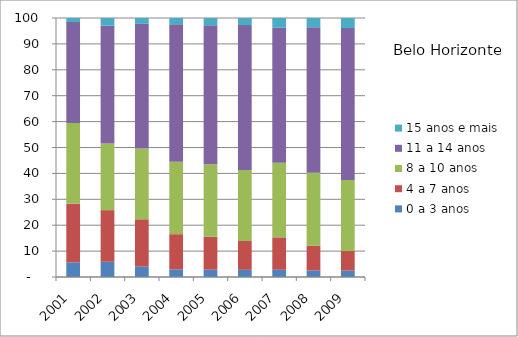
| Category | 0 a 3 anos | 4 a 7 anos | 8 a 10 anos | 11 a 14 anos | 15 anos e mais |
|---|---|---|---|---|---|
| 2001.0 | 5.66 | 22.68 | 31.08 | 38.99 | 2 |
| 2002.0 | 5.88 | 19.94 | 25.72 | 45.49 | 2.97 |
| 2003.0 | 4 | 18.27 | 27.34 | 48.12 | 2.27 |
| 2004.0 | 2.91 | 13.64 | 27.91 | 53.15 | 2.39 |
| 2005.0 | 2.82 | 12.72 | 28.01 | 53.63 | 2.82 |
| 2006.0 | 2.77 | 11.15 | 27.35 | 56.02 | 2.71 |
| 2007.0 | 2.79 | 12.52 | 28.81 | 52.11 | 3.76 |
| 2008.0 | 2.54 | 9.57 | 28.12 | 56.23 | 3.55 |
| 2009.0 | 2.47 | 7.55 | 27.46 | 58.62 | 3.9 |